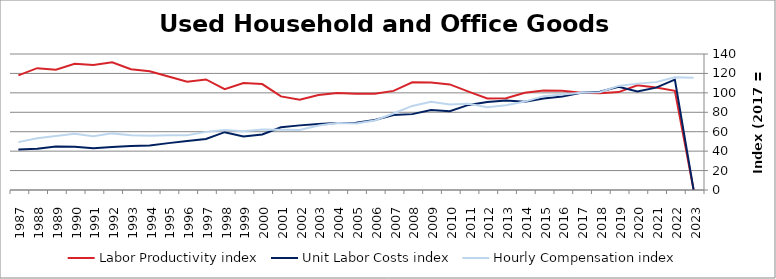
| Category | Labor Productivity index | Unit Labor Costs index | Hourly Compensation index |
|---|---|---|---|
| 2023.0 | 0 | 0 | 115.572 |
| 2022.0 | 102.132 | 113.69 | 116.114 |
| 2021.0 | 105.414 | 105.347 | 111.05 |
| 2020.0 | 107.857 | 101.529 | 109.506 |
| 2019.0 | 100.79 | 106.32 | 107.159 |
| 2018.0 | 99.576 | 101.062 | 100.634 |
| 2017.0 | 100 | 100 | 100 |
| 2016.0 | 102.056 | 96.251 | 98.231 |
| 2015.0 | 102.534 | 94.217 | 96.604 |
| 2014.0 | 100.132 | 90.88 | 91 |
| 2013.0 | 94.47 | 92.236 | 87.135 |
| 2012.0 | 94.248 | 90.515 | 85.309 |
| 2011.0 | 101.274 | 87.576 | 88.692 |
| 2010.0 | 108.712 | 80.996 | 88.053 |
| 2009.0 | 110.573 | 82.248 | 90.944 |
| 2008.0 | 110.807 | 78.107 | 86.548 |
| 2007.0 | 102.017 | 77.187 | 78.744 |
| 2006.0 | 99.199 | 72.115 | 71.537 |
| 2005.0 | 99.165 | 69.129 | 68.552 |
| 2004.0 | 99.786 | 69.028 | 68.88 |
| 2003.0 | 97.681 | 67.934 | 66.359 |
| 2002.0 | 92.862 | 66.526 | 61.777 |
| 2001.0 | 96.346 | 64.494 | 62.137 |
| 2000.0 | 109.063 | 57.19 | 62.373 |
| 1999.0 | 110.147 | 55.02 | 60.603 |
| 1998.0 | 103.78 | 59.531 | 61.781 |
| 1997.0 | 113.838 | 52.568 | 59.843 |
| 1996.0 | 111.554 | 50.545 | 56.385 |
| 1995.0 | 116.881 | 48.248 | 56.393 |
| 1994.0 | 122.284 | 45.691 | 55.873 |
| 1993.0 | 124.314 | 45.404 | 56.444 |
| 1992.0 | 131.558 | 44.303 | 58.284 |
| 1991.0 | 128.618 | 43.024 | 55.337 |
| 1990.0 | 129.882 | 44.55 | 57.863 |
| 1989.0 | 123.886 | 44.845 | 55.556 |
| 1988.0 | 125.411 | 42.443 | 53.228 |
| 1987.0 | 117.995 | 41.773 | 49.29 |